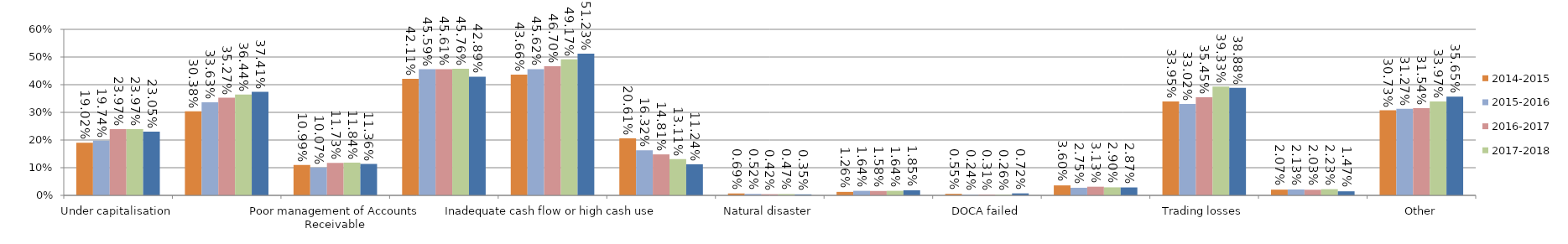
| Category | 2014-2015 | 2015-2016 | 2016-2017 | 2017-2018 | 2018-2019 |
|---|---|---|---|---|---|
| Under capitalisation | 0.19 | 0.197 | 0.24 | 0.24 | 0.23 |
| Poor financial control including lack of records | 0.304 | 0.336 | 0.353 | 0.364 | 0.374 |
| Poor management of Accounts Receivable | 0.11 | 0.101 | 0.117 | 0.118 | 0.114 |
| Poor strategic management of business | 0.421 | 0.456 | 0.456 | 0.458 | 0.429 |
| Inadequate cash flow or high cash use | 0.437 | 0.456 | 0.467 | 0.492 | 0.512 |
| Poor economic conditions | 0.206 | 0.163 | 0.148 | 0.131 | 0.112 |
| Natural disaster | 0.007 | 0.005 | 0.004 | 0.005 | 0.003 |
| Fraud | 0.013 | 0.016 | 0.016 | 0.016 | 0.019 |
| DOCA failed | 0.006 | 0.002 | 0.003 | 0.003 | 0.007 |
| Dispute among directors | 0.036 | 0.027 | 0.031 | 0.029 | 0.029 |
| Trading losses | 0.339 | 0.33 | 0.355 | 0.393 | 0.389 |
| Industry restructuring | 0.021 | 0.021 | 0.02 | 0.022 | 0.015 |
| Other | 0.307 | 0.313 | 0.315 | 0.34 | 0.356 |